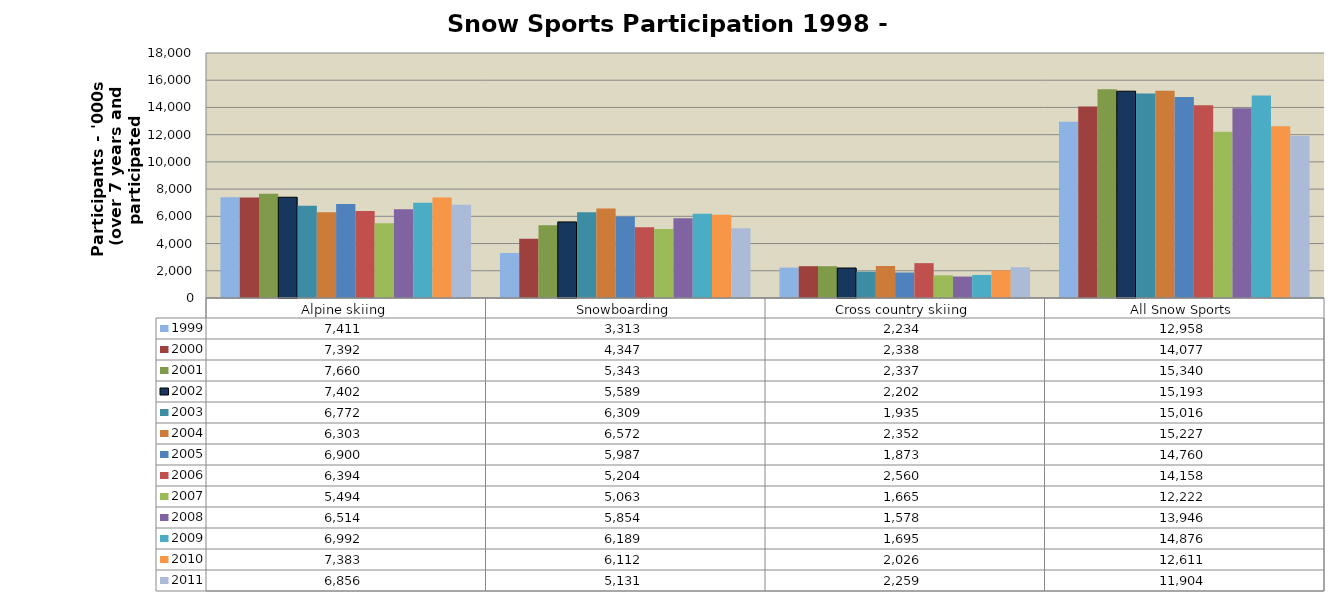
| Category | 1999 | 2000 | 2001 | 2002 | 2003 | 2004 | 2005 | 2006 | 2007 | 2008 | 2009 | 2010 | 2011 |
|---|---|---|---|---|---|---|---|---|---|---|---|---|---|
| Alpine skiing | 7411 | 7392 | 7660 | 7402 | 6772 | 6303 | 6900 | 6394 | 5494 | 6514 | 6992 | 7383 | 6856 |
| Snowboarding | 3313 | 4347 | 5343 | 5589 | 6309 | 6572 | 5987 | 5204 | 5063 | 5854 | 6189 | 6112 | 5131 |
| Cross country skiing | 2234 | 2338 | 2337 | 2202 | 1935 | 2352 | 1873 | 2560 | 1665 | 1578 | 1695 | 2026 | 2259 |
| All Snow Sports | 12958 | 14077 | 15340 | 15193 | 15016 | 15227 | 14760 | 14158 | 12222 | 13946 | 14876 | 12611 | 11904 |